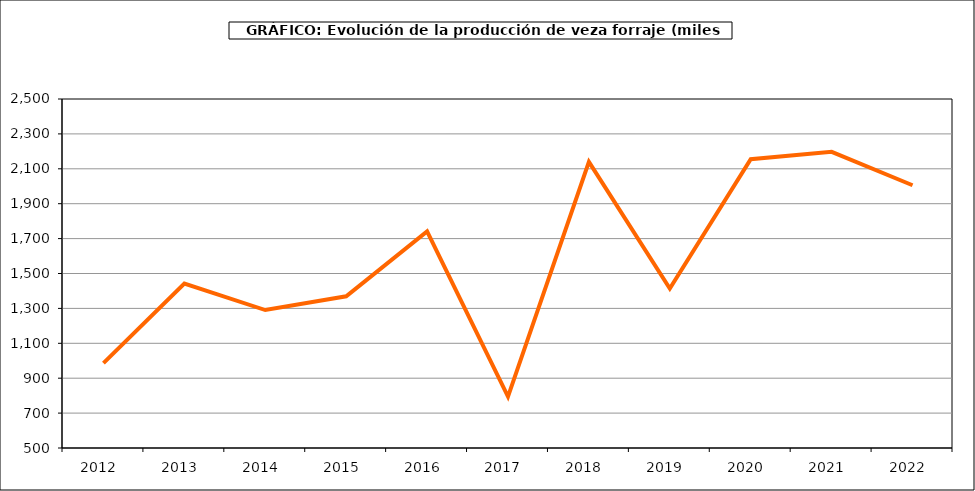
| Category | Producción |
|---|---|
| 2012.0 | 986.263 |
| 2013.0 | 1442.069 |
| 2014.0 | 1290.565 |
| 2015.0 | 1369.532 |
| 2016.0 | 1740.854 |
| 2017.0 | 794.791 |
| 2018.0 | 2139.418 |
| 2019.0 | 1413.909 |
| 2020.0 | 2155.042 |
| 2021.0 | 2197.287 |
| 2022.0 | 2005.84 |